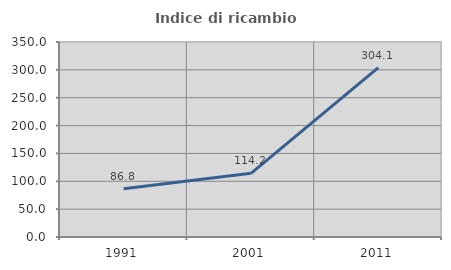
| Category | Indice di ricambio occupazionale  |
|---|---|
| 1991.0 | 86.765 |
| 2001.0 | 114.245 |
| 2011.0 | 304.103 |